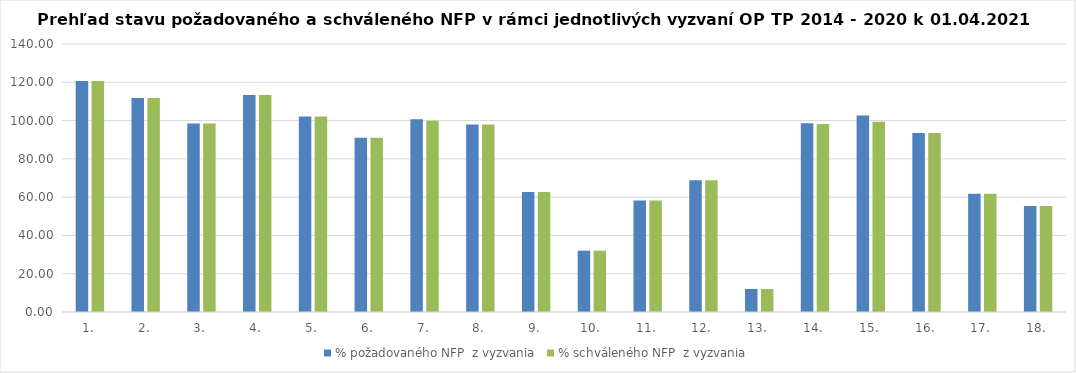
| Category | % požadovaného NFP  z vyzvania | % schváleného NFP  z vyzvania |
|---|---|---|
| 1. | 120.662 | 120.662 |
| 2. | 111.83 | 111.83 |
| 3. | 98.465 | 98.465 |
| 4. | 113.295 | 113.295 |
| 5. | 102.19 | 102.19 |
| 6. | 91.016 | 91.016 |
| 7. | 100.638 | 99.954 |
| 8. | 97.989 | 97.989 |
| 9. | 62.721 | 62.721 |
| 10. | 32.038 | 32.038 |
| 11. | 58.283 | 58.283 |
| 12. | 68.88 | 68.88 |
| 13. | 12.008 | 12.008 |
| 14. | 98.618 | 98.273 |
| 15. | 102.693 | 99.394 |
| 16. | 93.51 | 93.51 |
| 17. | 61.754 | 61.754 |
| 18. | 55.313 | 55.313 |